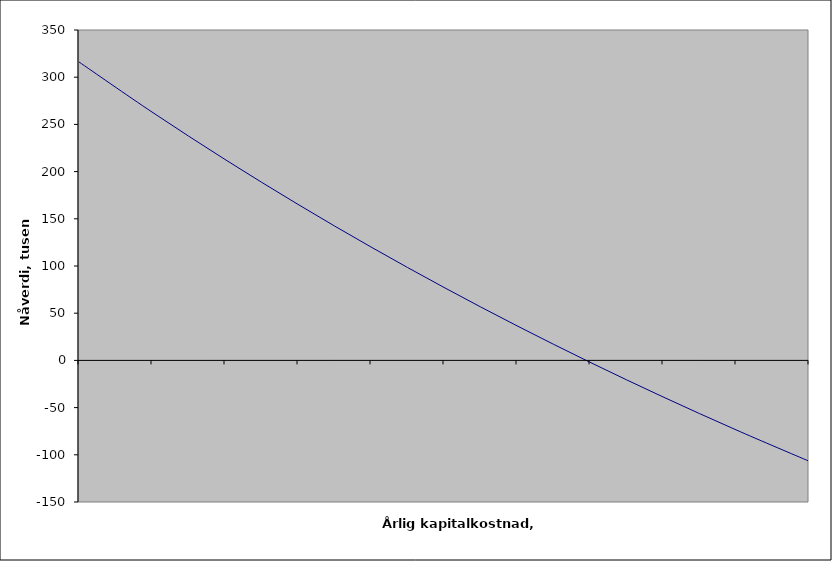
| Category | Series 0 |
|---|---|
| nan | 316.15 |
| 1.0 | 263.113 |
| 2.0 | 212.879 |
| 3.0 | 165.272 |
| 4.0 | 120.13 |
| 5.0 | 77.3 |
| 6.0 | 36.644 |
| 7.0 | -1.97 |
| 8.0 | -38.664 |
| 9.0 | -73.551 |
| 10.0 | -106.737 |